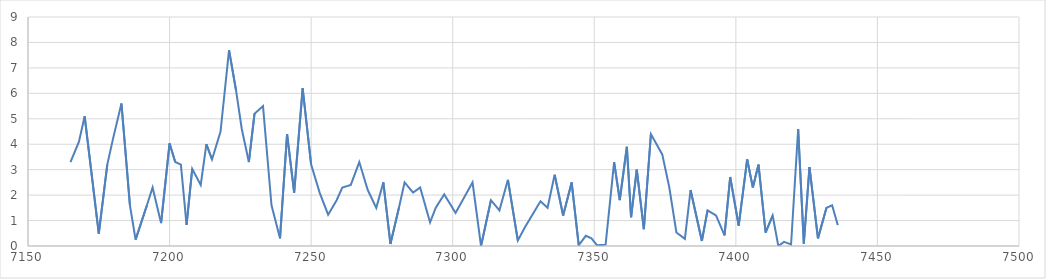
| Category | Series 0 |
|---|---|
| 7165.0 | 3.3 |
| 7168.0 | 4.1 |
| 7170.0 | 5.1 |
| 7175.0 | 0.49 |
| 7178.0 | 3.2 |
| 7180.0 | 4.2 |
| 7183.0 | 5.6 |
| 7186.0 | 1.6 |
| 7188.0 | 0.25 |
| 7192.0 | 1.6 |
| 7194.0 | 2.3 |
| 7197.0 | 0.9 |
| 7200.0 | 4.03 |
| 7202.0 | 3.3 |
| 7204.0 | 3.2 |
| 7206.0 | 0.83 |
| 7208.0 | 3.03 |
| 7211.0 | 2.4 |
| 7213.0 | 4 |
| 7215.0 | 3.4 |
| 7218.0 | 4.5 |
| 7221.0 | 7.7 |
| 7223.5 | 6.1 |
| 7225.5 | 4.6 |
| 7228.0 | 3.3 |
| 7230.0 | 5.2 |
| 7233.0 | 5.5 |
| 7236.0 | 1.6 |
| 7239.0 | 0.3 |
| 7241.5 | 4.4 |
| 7244.0 | 2.1 |
| 7247.0 | 6.2 |
| 7250.0 | 3.2 |
| 7253.0 | 2.1 |
| 7256.0 | 1.23 |
| 7259.0 | 1.8 |
| 7261.0 | 2.3 |
| 7264.0 | 2.4 |
| 7267.0 | 3.3 |
| 7270.0 | 2.2 |
| 7273.0 | 1.5 |
| 7275.5 | 2.5 |
| 7278.0 | 0.08 |
| 7281.0 | 1.5 |
| 7283.0 | 2.5 |
| 7286.0 | 2.1 |
| 7288.5 | 2.3 |
| 7292.0 | 0.93 |
| 7294.0 | 1.5 |
| 7297.0 | 2.03 |
| 7301.0 | 1.3 |
| 7307.0 | 2.5 |
| 7310.0 | 0 |
| 7313.5 | 1.8 |
| 7316.5 | 1.4 |
| 7319.5 | 2.6 |
| 7323.0 | 0.22 |
| 7325.5 | 0.74 |
| 7331.0 | 1.76 |
| 7333.5 | 1.5 |
| 7336.0 | 2.8 |
| 7339.0 | 1.2 |
| 7342.0 | 2.5 |
| 7344.5 | 0.03 |
| 7347.0 | 0.4 |
| 7349.0 | 0.3 |
| 7351.0 | 0.027 |
| 7354.0 | 0.052 |
| 7357.0 | 3.3 |
| 7359.0 | 1.8 |
| 7361.5 | 3.9 |
| 7363.0 | 1.13 |
| 7365.0 | 3 |
| 7367.5 | 0.66 |
| 7370.0 | 4.4 |
| 7372.0 | 4 |
| 7374.0 | 3.6 |
| 7376.5 | 2.3 |
| 7379.0 | 0.53 |
| 7382.0 | 0.28 |
| 7384.0 | 2.2 |
| 7388.0 | 0.2 |
| 7390.0 | 1.4 |
| 7393.0 | 1.2 |
| 7396.0 | 0.42 |
| 7398.0 | 2.71 |
| 7401.0 | 0.8 |
| 7404.0 | 3.4 |
| 7406.0 | 2.3 |
| 7408.0 | 3.2 |
| 7410.5 | 0.53 |
| 7413.0 | 1.2 |
| 7415.0 | 0 |
| 7417.0 | 0.16 |
| 7419.5 | 0.06 |
| 7422.0 | 4.6 |
| 7424.0 | 0.1 |
| 7426.0 | 3.1 |
| 7429.0 | 0.3 |
| 7432.0 | 1.5 |
| 7434.0 | 1.6 |
| 7436.0 | 0.82 |